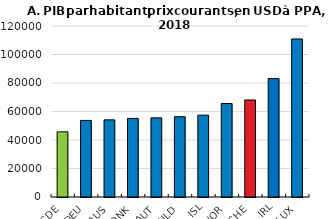
| Category | OCDE et 10 pays les plus riches  |
|---|---|
| OCDE | 45728.968 |
| DEU | 53749.441 |
| AUS | 54144.177 |
| DNK | 55137.815 |
| AUT | 55528.87 |
| NLD | 56325.699 |
| ISL | 57453.368 |
| NOR | 65602.903 |
| CHE | 68078.669 |
| IRL | 83081.132 |
| LUX | 110906.392 |